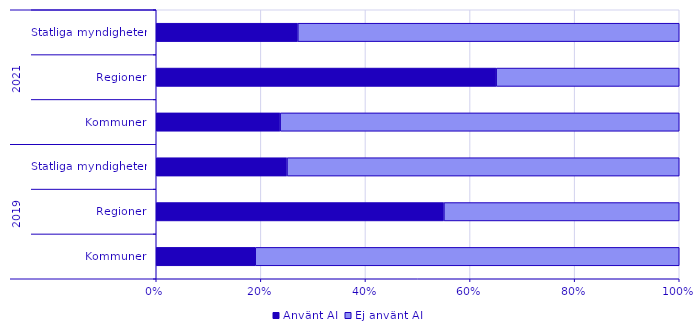
| Category | Använt AI | Ej använt AI |
|---|---|---|
| 0 | 0.189 | 0.811 |
| 1 | 0.55 | 0.45 |
| 2 | 0.25 | 0.75 |
| 3 | 0.237 | 0.763 |
| 4 | 0.65 | 0.35 |
| 5 | 0.271 | 0.729 |